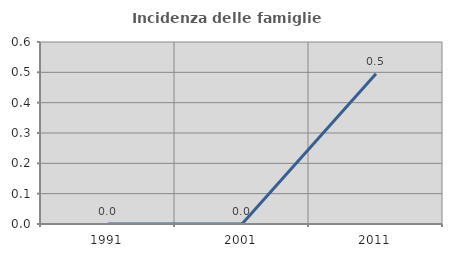
| Category | Incidenza delle famiglie numerose |
|---|---|
| 1991.0 | 0 |
| 2001.0 | 0 |
| 2011.0 | 0.495 |